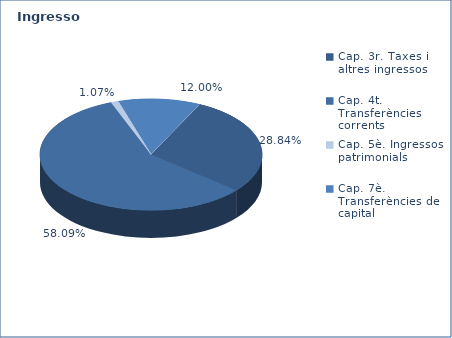
| Category | Series 0 |
|---|---|
| Cap. 3r. Taxes i altres ingressos | 81535424 |
| Cap. 4t. Transferències corrents | 164226486 |
| Cap. 5è. Ingressos patrimonials | 3017896 |
| Cap. 7è. Transferències de capital | 33926280 |
| Cap. 8è. Actius financers | 0 |
| Cap. 9è. Préstecs | 0 |